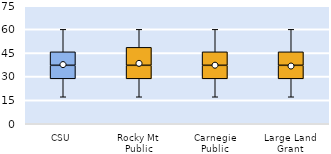
| Category | 25th | 50th | 75th |
|---|---|---|---|
| CSU | 28.571 | 8.571 | 8.571 |
| Rocky Mt Public | 28.571 | 8.571 | 11.429 |
| Carnegie Public | 28.571 | 8.571 | 8.571 |
| Large Land Grant | 28.571 | 8.571 | 8.571 |